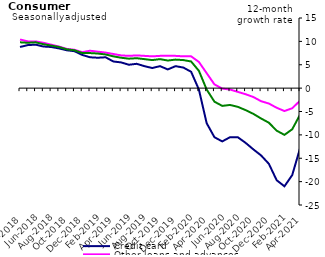
| Category | Credit card | Other loans and advances | Total |
|---|---|---|---|
| Apr-2018 | 8.8 | 10.4 | 9.8 |
| May-2018 | 9.2 | 10 | 9.7 |
| Jun-2018 | 9.3 | 10 | 9.8 |
| Jul-2018 | 8.9 | 9.7 | 9.4 |
| Aug-2018 | 8.8 | 9.3 | 9.1 |
| Sep-2018 | 8.5 | 8.9 | 8.8 |
| Oct-2018 | 8.1 | 8.4 | 8.3 |
| Nov-2018 | 7.9 | 8.2 | 8.1 |
| Dec-2018 | 7.1 | 7.7 | 7.5 |
| Jan-2019 | 6.6 | 8 | 7.5 |
| Feb-2019 | 6.5 | 7.8 | 7.4 |
| Mar-2019 | 6.6 | 7.6 | 7.2 |
| Apr-2019 | 5.7 | 7.3 | 6.8 |
| May-2019 | 5.5 | 7 | 6.5 |
| Jun-2019 | 5 | 6.9 | 6.3 |
| Jul-2019 | 5.2 | 7 | 6.4 |
| Aug-2019 | 4.7 | 6.9 | 6.2 |
| Sep-2019 | 4.3 | 6.8 | 6 |
| Oct-2019 | 4.7 | 6.9 | 6.2 |
| Nov-2019 | 4 | 6.9 | 5.9 |
| Dec-2019 | 4.7 | 6.9 | 6.1 |
| Jan-2020 | 4.4 | 6.8 | 6 |
| Feb-2020 | 3.5 | 6.8 | 5.7 |
| Mar-2020 | -0.3 | 5.6 | 3.7 |
| Apr-2020 | -7.5 | 3.2 | -0.3 |
| May-2020 | -10.5 | 0.8 | -2.9 |
| Jun-2020 | -11.4 | -0.1 | -3.8 |
| Jul-2020 | -10.5 | -0.3 | -3.6 |
| Aug-2020 | -10.5 | -0.8 | -4 |
| Sep-2020 | -11.7 | -1.3 | -4.7 |
| Oct-2020 | -13.1 | -1.9 | -5.5 |
| Nov-2020 | -14.4 | -2.8 | -6.5 |
| Dec-2020 | -16.2 | -3.3 | -7.4 |
| Jan-2021 | -19.7 | -4.2 | -9.1 |
| Feb-2021 | -21 | -4.9 | -10 |
| Mar-2021 | -18.6 | -4.3 | -8.8 |
| Apr-2021 | -12.9 | -2.7 | -5.7 |